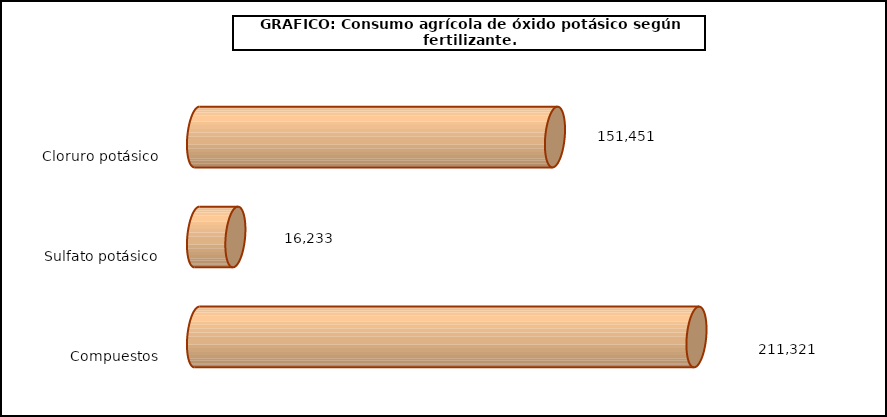
| Category | fert. N |
|---|---|
| 0 | 151451 |
| 1 | 16233 |
| 2 | 211321 |